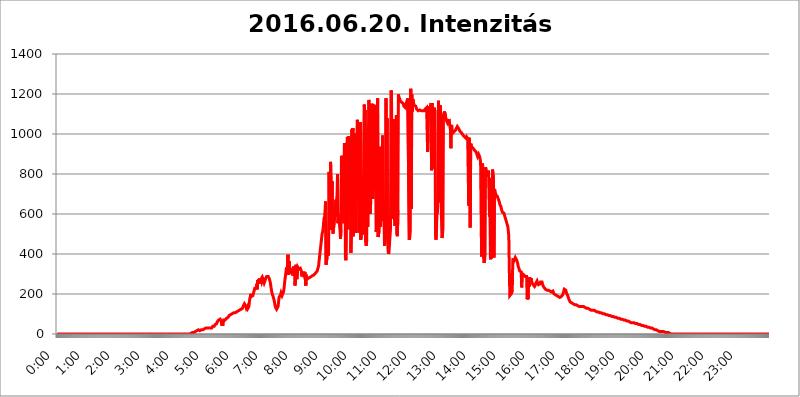
| Category | 2016.06.20. Intenzitás [W/m^2] |
|---|---|
| 0.0 | 0 |
| 0.0006944444444444445 | 0 |
| 0.001388888888888889 | 0 |
| 0.0020833333333333333 | 0 |
| 0.002777777777777778 | 0 |
| 0.003472222222222222 | 0 |
| 0.004166666666666667 | 0 |
| 0.004861111111111111 | 0 |
| 0.005555555555555556 | 0 |
| 0.0062499999999999995 | 0 |
| 0.006944444444444444 | 0 |
| 0.007638888888888889 | 0 |
| 0.008333333333333333 | 0 |
| 0.009027777777777779 | 0 |
| 0.009722222222222222 | 0 |
| 0.010416666666666666 | 0 |
| 0.011111111111111112 | 0 |
| 0.011805555555555555 | 0 |
| 0.012499999999999999 | 0 |
| 0.013194444444444444 | 0 |
| 0.013888888888888888 | 0 |
| 0.014583333333333332 | 0 |
| 0.015277777777777777 | 0 |
| 0.015972222222222224 | 0 |
| 0.016666666666666666 | 0 |
| 0.017361111111111112 | 0 |
| 0.018055555555555557 | 0 |
| 0.01875 | 0 |
| 0.019444444444444445 | 0 |
| 0.02013888888888889 | 0 |
| 0.020833333333333332 | 0 |
| 0.02152777777777778 | 0 |
| 0.022222222222222223 | 0 |
| 0.02291666666666667 | 0 |
| 0.02361111111111111 | 0 |
| 0.024305555555555556 | 0 |
| 0.024999999999999998 | 0 |
| 0.025694444444444447 | 0 |
| 0.02638888888888889 | 0 |
| 0.027083333333333334 | 0 |
| 0.027777777777777776 | 0 |
| 0.02847222222222222 | 0 |
| 0.029166666666666664 | 0 |
| 0.029861111111111113 | 0 |
| 0.030555555555555555 | 0 |
| 0.03125 | 0 |
| 0.03194444444444445 | 0 |
| 0.03263888888888889 | 0 |
| 0.03333333333333333 | 0 |
| 0.034027777777777775 | 0 |
| 0.034722222222222224 | 0 |
| 0.035416666666666666 | 0 |
| 0.036111111111111115 | 0 |
| 0.03680555555555556 | 0 |
| 0.0375 | 0 |
| 0.03819444444444444 | 0 |
| 0.03888888888888889 | 0 |
| 0.03958333333333333 | 0 |
| 0.04027777777777778 | 0 |
| 0.04097222222222222 | 0 |
| 0.041666666666666664 | 0 |
| 0.042361111111111106 | 0 |
| 0.04305555555555556 | 0 |
| 0.043750000000000004 | 0 |
| 0.044444444444444446 | 0 |
| 0.04513888888888889 | 0 |
| 0.04583333333333334 | 0 |
| 0.04652777777777778 | 0 |
| 0.04722222222222222 | 0 |
| 0.04791666666666666 | 0 |
| 0.04861111111111111 | 0 |
| 0.049305555555555554 | 0 |
| 0.049999999999999996 | 0 |
| 0.05069444444444445 | 0 |
| 0.051388888888888894 | 0 |
| 0.052083333333333336 | 0 |
| 0.05277777777777778 | 0 |
| 0.05347222222222222 | 0 |
| 0.05416666666666667 | 0 |
| 0.05486111111111111 | 0 |
| 0.05555555555555555 | 0 |
| 0.05625 | 0 |
| 0.05694444444444444 | 0 |
| 0.057638888888888885 | 0 |
| 0.05833333333333333 | 0 |
| 0.05902777777777778 | 0 |
| 0.059722222222222225 | 0 |
| 0.06041666666666667 | 0 |
| 0.061111111111111116 | 0 |
| 0.06180555555555556 | 0 |
| 0.0625 | 0 |
| 0.06319444444444444 | 0 |
| 0.06388888888888888 | 0 |
| 0.06458333333333334 | 0 |
| 0.06527777777777778 | 0 |
| 0.06597222222222222 | 0 |
| 0.06666666666666667 | 0 |
| 0.06736111111111111 | 0 |
| 0.06805555555555555 | 0 |
| 0.06874999999999999 | 0 |
| 0.06944444444444443 | 0 |
| 0.07013888888888889 | 0 |
| 0.07083333333333333 | 0 |
| 0.07152777777777779 | 0 |
| 0.07222222222222223 | 0 |
| 0.07291666666666667 | 0 |
| 0.07361111111111111 | 0 |
| 0.07430555555555556 | 0 |
| 0.075 | 0 |
| 0.07569444444444444 | 0 |
| 0.0763888888888889 | 0 |
| 0.07708333333333334 | 0 |
| 0.07777777777777778 | 0 |
| 0.07847222222222222 | 0 |
| 0.07916666666666666 | 0 |
| 0.0798611111111111 | 0 |
| 0.08055555555555556 | 0 |
| 0.08125 | 0 |
| 0.08194444444444444 | 0 |
| 0.08263888888888889 | 0 |
| 0.08333333333333333 | 0 |
| 0.08402777777777777 | 0 |
| 0.08472222222222221 | 0 |
| 0.08541666666666665 | 0 |
| 0.08611111111111112 | 0 |
| 0.08680555555555557 | 0 |
| 0.08750000000000001 | 0 |
| 0.08819444444444445 | 0 |
| 0.08888888888888889 | 0 |
| 0.08958333333333333 | 0 |
| 0.09027777777777778 | 0 |
| 0.09097222222222222 | 0 |
| 0.09166666666666667 | 0 |
| 0.09236111111111112 | 0 |
| 0.09305555555555556 | 0 |
| 0.09375 | 0 |
| 0.09444444444444444 | 0 |
| 0.09513888888888888 | 0 |
| 0.09583333333333333 | 0 |
| 0.09652777777777777 | 0 |
| 0.09722222222222222 | 0 |
| 0.09791666666666667 | 0 |
| 0.09861111111111111 | 0 |
| 0.09930555555555555 | 0 |
| 0.09999999999999999 | 0 |
| 0.10069444444444443 | 0 |
| 0.1013888888888889 | 0 |
| 0.10208333333333335 | 0 |
| 0.10277777777777779 | 0 |
| 0.10347222222222223 | 0 |
| 0.10416666666666667 | 0 |
| 0.10486111111111111 | 0 |
| 0.10555555555555556 | 0 |
| 0.10625 | 0 |
| 0.10694444444444444 | 0 |
| 0.1076388888888889 | 0 |
| 0.10833333333333334 | 0 |
| 0.10902777777777778 | 0 |
| 0.10972222222222222 | 0 |
| 0.1111111111111111 | 0 |
| 0.11180555555555556 | 0 |
| 0.11180555555555556 | 0 |
| 0.1125 | 0 |
| 0.11319444444444444 | 0 |
| 0.11388888888888889 | 0 |
| 0.11458333333333333 | 0 |
| 0.11527777777777777 | 0 |
| 0.11597222222222221 | 0 |
| 0.11666666666666665 | 0 |
| 0.1173611111111111 | 0 |
| 0.11805555555555557 | 0 |
| 0.11944444444444445 | 0 |
| 0.12013888888888889 | 0 |
| 0.12083333333333333 | 0 |
| 0.12152777777777778 | 0 |
| 0.12222222222222223 | 0 |
| 0.12291666666666667 | 0 |
| 0.12291666666666667 | 0 |
| 0.12361111111111112 | 0 |
| 0.12430555555555556 | 0 |
| 0.125 | 0 |
| 0.12569444444444444 | 0 |
| 0.12638888888888888 | 0 |
| 0.12708333333333333 | 0 |
| 0.16875 | 0 |
| 0.12847222222222224 | 0 |
| 0.12916666666666668 | 0 |
| 0.12986111111111112 | 0 |
| 0.13055555555555556 | 0 |
| 0.13125 | 0 |
| 0.13194444444444445 | 0 |
| 0.1326388888888889 | 0 |
| 0.13333333333333333 | 0 |
| 0.13402777777777777 | 0 |
| 0.13402777777777777 | 0 |
| 0.13472222222222222 | 0 |
| 0.13541666666666666 | 0 |
| 0.1361111111111111 | 0 |
| 0.13749999999999998 | 0 |
| 0.13819444444444443 | 0 |
| 0.1388888888888889 | 0 |
| 0.13958333333333334 | 0 |
| 0.14027777777777778 | 0 |
| 0.14097222222222222 | 0 |
| 0.14166666666666666 | 0 |
| 0.1423611111111111 | 0 |
| 0.14305555555555557 | 0 |
| 0.14375000000000002 | 0 |
| 0.14444444444444446 | 0 |
| 0.1451388888888889 | 0 |
| 0.1451388888888889 | 0 |
| 0.14652777777777778 | 0 |
| 0.14722222222222223 | 0 |
| 0.14791666666666667 | 0 |
| 0.1486111111111111 | 0 |
| 0.14930555555555555 | 0 |
| 0.15 | 0 |
| 0.15069444444444444 | 0 |
| 0.15138888888888888 | 0 |
| 0.15208333333333332 | 0 |
| 0.15277777777777776 | 0 |
| 0.15347222222222223 | 0 |
| 0.15416666666666667 | 0 |
| 0.15486111111111112 | 0 |
| 0.15555555555555556 | 0 |
| 0.15625 | 0 |
| 0.15694444444444444 | 0 |
| 0.15763888888888888 | 0 |
| 0.15833333333333333 | 0 |
| 0.15902777777777777 | 0 |
| 0.15972222222222224 | 0 |
| 0.16041666666666668 | 0 |
| 0.16111111111111112 | 0 |
| 0.16180555555555556 | 0 |
| 0.1625 | 0 |
| 0.16319444444444445 | 0 |
| 0.1638888888888889 | 0 |
| 0.16458333333333333 | 0 |
| 0.16527777777777777 | 0 |
| 0.16597222222222222 | 0 |
| 0.16666666666666666 | 0 |
| 0.1673611111111111 | 0 |
| 0.16805555555555554 | 0 |
| 0.16874999999999998 | 0 |
| 0.16944444444444443 | 0 |
| 0.17013888888888887 | 0 |
| 0.1708333333333333 | 0 |
| 0.17152777777777775 | 0 |
| 0.17222222222222225 | 0 |
| 0.1729166666666667 | 0 |
| 0.17361111111111113 | 0 |
| 0.17430555555555557 | 0 |
| 0.17500000000000002 | 0 |
| 0.17569444444444446 | 0 |
| 0.1763888888888889 | 0 |
| 0.17708333333333334 | 0 |
| 0.17777777777777778 | 0 |
| 0.17847222222222223 | 0 |
| 0.17916666666666667 | 0 |
| 0.1798611111111111 | 0 |
| 0.18055555555555555 | 0 |
| 0.18125 | 0 |
| 0.18194444444444444 | 0 |
| 0.1826388888888889 | 0 |
| 0.18333333333333335 | 0 |
| 0.1840277777777778 | 0 |
| 0.18472222222222223 | 0 |
| 0.18541666666666667 | 0 |
| 0.18611111111111112 | 0 |
| 0.18680555555555556 | 0 |
| 0.1875 | 3.525 |
| 0.18819444444444444 | 3.525 |
| 0.18888888888888888 | 3.525 |
| 0.18958333333333333 | 7.887 |
| 0.19027777777777777 | 7.887 |
| 0.1909722222222222 | 7.887 |
| 0.19166666666666665 | 7.887 |
| 0.19236111111111112 | 12.257 |
| 0.19305555555555554 | 12.257 |
| 0.19375 | 12.257 |
| 0.19444444444444445 | 12.257 |
| 0.1951388888888889 | 16.636 |
| 0.19583333333333333 | 16.636 |
| 0.19652777777777777 | 16.636 |
| 0.19722222222222222 | 21.024 |
| 0.19791666666666666 | 21.024 |
| 0.1986111111111111 | 16.636 |
| 0.19930555555555554 | 16.636 |
| 0.19999999999999998 | 16.636 |
| 0.20069444444444443 | 16.636 |
| 0.20138888888888887 | 21.024 |
| 0.2020833333333333 | 21.024 |
| 0.2027777777777778 | 21.024 |
| 0.2034722222222222 | 21.024 |
| 0.2041666666666667 | 21.024 |
| 0.20486111111111113 | 21.024 |
| 0.20555555555555557 | 25.419 |
| 0.20625000000000002 | 25.419 |
| 0.20694444444444446 | 25.419 |
| 0.2076388888888889 | 25.419 |
| 0.20833333333333334 | 29.823 |
| 0.20902777777777778 | 29.823 |
| 0.20972222222222223 | 29.823 |
| 0.21041666666666667 | 29.823 |
| 0.2111111111111111 | 29.823 |
| 0.21180555555555555 | 29.823 |
| 0.2125 | 29.823 |
| 0.21319444444444444 | 34.234 |
| 0.2138888888888889 | 29.823 |
| 0.21458333333333335 | 29.823 |
| 0.2152777777777778 | 34.234 |
| 0.21597222222222223 | 29.823 |
| 0.21666666666666667 | 29.823 |
| 0.21736111111111112 | 29.823 |
| 0.21805555555555556 | 38.653 |
| 0.21875 | 34.234 |
| 0.21944444444444444 | 34.234 |
| 0.22013888888888888 | 38.653 |
| 0.22083333333333333 | 38.653 |
| 0.22152777777777777 | 47.511 |
| 0.2222222222222222 | 51.951 |
| 0.22291666666666665 | 43.079 |
| 0.2236111111111111 | 51.951 |
| 0.22430555555555556 | 60.85 |
| 0.225 | 56.398 |
| 0.22569444444444445 | 60.85 |
| 0.2263888888888889 | 69.775 |
| 0.22708333333333333 | 65.31 |
| 0.22777777777777777 | 74.246 |
| 0.22847222222222222 | 74.246 |
| 0.22916666666666666 | 69.775 |
| 0.2298611111111111 | 65.31 |
| 0.23055555555555554 | 47.511 |
| 0.23124999999999998 | 43.079 |
| 0.23194444444444443 | 43.079 |
| 0.23263888888888887 | 47.511 |
| 0.2333333333333333 | 69.775 |
| 0.2340277777777778 | 69.775 |
| 0.2347222222222222 | 69.775 |
| 0.2354166666666667 | 69.775 |
| 0.23611111111111113 | 65.31 |
| 0.23680555555555557 | 69.775 |
| 0.23750000000000002 | 78.722 |
| 0.23819444444444446 | 83.205 |
| 0.2388888888888889 | 83.205 |
| 0.23958333333333334 | 83.205 |
| 0.24027777777777778 | 87.692 |
| 0.24097222222222223 | 92.184 |
| 0.24166666666666667 | 96.682 |
| 0.2423611111111111 | 96.682 |
| 0.24305555555555555 | 96.682 |
| 0.24375 | 101.184 |
| 0.24444444444444446 | 101.184 |
| 0.24513888888888888 | 101.184 |
| 0.24583333333333335 | 101.184 |
| 0.2465277777777778 | 105.69 |
| 0.24722222222222223 | 105.69 |
| 0.24791666666666667 | 105.69 |
| 0.24861111111111112 | 105.69 |
| 0.24930555555555556 | 105.69 |
| 0.25 | 110.201 |
| 0.25069444444444444 | 110.201 |
| 0.2513888888888889 | 110.201 |
| 0.2520833333333333 | 110.201 |
| 0.25277777777777777 | 110.201 |
| 0.2534722222222222 | 114.716 |
| 0.25416666666666665 | 114.716 |
| 0.2548611111111111 | 119.235 |
| 0.2555555555555556 | 119.235 |
| 0.25625000000000003 | 119.235 |
| 0.2569444444444445 | 119.235 |
| 0.2576388888888889 | 123.758 |
| 0.25833333333333336 | 123.758 |
| 0.2590277777777778 | 128.284 |
| 0.25972222222222224 | 128.284 |
| 0.2604166666666667 | 132.814 |
| 0.2611111111111111 | 141.884 |
| 0.26180555555555557 | 146.423 |
| 0.2625 | 150.964 |
| 0.26319444444444445 | 150.964 |
| 0.2638888888888889 | 146.423 |
| 0.26458333333333334 | 137.347 |
| 0.2652777777777778 | 128.284 |
| 0.2659722222222222 | 132.814 |
| 0.26666666666666666 | 137.347 |
| 0.2673611111111111 | 128.284 |
| 0.26805555555555555 | 128.284 |
| 0.26875 | 137.347 |
| 0.26944444444444443 | 160.056 |
| 0.2701388888888889 | 178.264 |
| 0.2708333333333333 | 187.378 |
| 0.27152777777777776 | 201.058 |
| 0.2722222222222222 | 187.378 |
| 0.27291666666666664 | 182.82 |
| 0.2736111111111111 | 182.82 |
| 0.2743055555555555 | 191.937 |
| 0.27499999999999997 | 201.058 |
| 0.27569444444444446 | 210.182 |
| 0.27638888888888885 | 219.309 |
| 0.27708333333333335 | 228.436 |
| 0.2777777777777778 | 228.436 |
| 0.27847222222222223 | 228.436 |
| 0.2791666666666667 | 228.436 |
| 0.2798611111111111 | 251.251 |
| 0.28055555555555556 | 223.873 |
| 0.28125 | 269.49 |
| 0.28194444444444444 | 255.813 |
| 0.2826388888888889 | 274.047 |
| 0.2833333333333333 | 260.373 |
| 0.28402777777777777 | 278.603 |
| 0.2847222222222222 | 251.251 |
| 0.28541666666666665 | 255.813 |
| 0.28611111111111115 | 269.49 |
| 0.28680555555555554 | 260.373 |
| 0.28750000000000003 | 264.932 |
| 0.2881944444444445 | 278.603 |
| 0.2888888888888889 | 278.603 |
| 0.28958333333333336 | 264.932 |
| 0.2902777777777778 | 255.813 |
| 0.29097222222222224 | 260.373 |
| 0.2916666666666667 | 269.49 |
| 0.2923611111111111 | 278.603 |
| 0.29305555555555557 | 283.156 |
| 0.29375 | 287.709 |
| 0.29444444444444445 | 287.709 |
| 0.2951388888888889 | 287.709 |
| 0.29583333333333334 | 287.709 |
| 0.2965277777777778 | 283.156 |
| 0.2972222222222222 | 278.603 |
| 0.29791666666666666 | 274.047 |
| 0.2986111111111111 | 260.373 |
| 0.29930555555555555 | 246.689 |
| 0.3 | 228.436 |
| 0.30069444444444443 | 214.746 |
| 0.3013888888888889 | 201.058 |
| 0.3020833333333333 | 196.497 |
| 0.30277777777777776 | 187.378 |
| 0.3034722222222222 | 178.264 |
| 0.30416666666666664 | 169.156 |
| 0.3048611111111111 | 155.509 |
| 0.3055555555555555 | 141.884 |
| 0.30624999999999997 | 132.814 |
| 0.3069444444444444 | 128.284 |
| 0.3076388888888889 | 123.758 |
| 0.30833333333333335 | 119.235 |
| 0.3090277777777778 | 123.758 |
| 0.30972222222222223 | 137.347 |
| 0.3104166666666667 | 160.056 |
| 0.3111111111111111 | 182.82 |
| 0.31180555555555556 | 187.378 |
| 0.3125 | 187.378 |
| 0.31319444444444444 | 196.497 |
| 0.3138888888888889 | 205.62 |
| 0.3145833333333333 | 205.62 |
| 0.31527777777777777 | 191.937 |
| 0.3159722222222222 | 191.937 |
| 0.31666666666666665 | 196.497 |
| 0.31736111111111115 | 210.182 |
| 0.31805555555555554 | 228.436 |
| 0.31875000000000003 | 251.251 |
| 0.3194444444444445 | 274.047 |
| 0.3201388888888889 | 292.259 |
| 0.32083333333333336 | 296.808 |
| 0.3215277777777778 | 333.113 |
| 0.32222222222222224 | 333.113 |
| 0.3229166666666667 | 319.517 |
| 0.3236111111111111 | 396.164 |
| 0.32430555555555557 | 296.808 |
| 0.325 | 364.728 |
| 0.32569444444444445 | 333.113 |
| 0.3263888888888889 | 319.517 |
| 0.32708333333333334 | 310.44 |
| 0.3277777777777778 | 310.44 |
| 0.3284722222222222 | 314.98 |
| 0.32916666666666666 | 319.517 |
| 0.3298611111111111 | 305.898 |
| 0.33055555555555555 | 292.259 |
| 0.33125 | 337.639 |
| 0.33194444444444443 | 342.162 |
| 0.3326388888888889 | 324.052 |
| 0.3333333333333333 | 242.127 |
| 0.3340277777777778 | 260.373 |
| 0.3347222222222222 | 346.682 |
| 0.3354166666666667 | 287.709 |
| 0.3361111111111111 | 274.047 |
| 0.3368055555555556 | 305.898 |
| 0.33749999999999997 | 333.113 |
| 0.33819444444444446 | 333.113 |
| 0.33888888888888885 | 324.052 |
| 0.33958333333333335 | 324.052 |
| 0.34027777777777773 | 319.517 |
| 0.34097222222222223 | 328.584 |
| 0.3416666666666666 | 324.052 |
| 0.3423611111111111 | 314.98 |
| 0.3430555555555555 | 287.709 |
| 0.34375 | 305.898 |
| 0.3444444444444445 | 310.44 |
| 0.3451388888888889 | 310.44 |
| 0.3458333333333334 | 305.898 |
| 0.34652777777777777 | 283.156 |
| 0.34722222222222227 | 310.44 |
| 0.34791666666666665 | 310.44 |
| 0.34861111111111115 | 242.127 |
| 0.34930555555555554 | 296.808 |
| 0.35000000000000003 | 274.047 |
| 0.3506944444444444 | 274.047 |
| 0.3513888888888889 | 278.603 |
| 0.3520833333333333 | 278.603 |
| 0.3527777777777778 | 278.603 |
| 0.3534722222222222 | 278.603 |
| 0.3541666666666667 | 283.156 |
| 0.3548611111111111 | 283.156 |
| 0.35555555555555557 | 287.709 |
| 0.35625 | 287.709 |
| 0.35694444444444445 | 287.709 |
| 0.3576388888888889 | 287.709 |
| 0.35833333333333334 | 292.259 |
| 0.3590277777777778 | 296.808 |
| 0.3597222222222222 | 296.808 |
| 0.36041666666666666 | 296.808 |
| 0.3611111111111111 | 296.808 |
| 0.36180555555555555 | 301.354 |
| 0.3625 | 305.898 |
| 0.36319444444444443 | 305.898 |
| 0.3638888888888889 | 310.44 |
| 0.3645833333333333 | 314.98 |
| 0.3652777777777778 | 324.052 |
| 0.3659722222222222 | 328.584 |
| 0.3666666666666667 | 342.162 |
| 0.3673611111111111 | 369.23 |
| 0.3680555555555556 | 391.685 |
| 0.36874999999999997 | 414.035 |
| 0.36944444444444446 | 436.27 |
| 0.37013888888888885 | 458.38 |
| 0.37083333333333335 | 480.356 |
| 0.37152777777777773 | 502.192 |
| 0.37222222222222223 | 510.885 |
| 0.3729166666666666 | 528.2 |
| 0.3736111111111111 | 558.261 |
| 0.3743055555555555 | 579.542 |
| 0.375 | 588.009 |
| 0.3756944444444445 | 621.613 |
| 0.3763888888888889 | 663.019 |
| 0.3770833333333334 | 346.682 |
| 0.37777777777777777 | 342.162 |
| 0.37847222222222227 | 387.202 |
| 0.37916666666666665 | 414.035 |
| 0.37986111111111115 | 391.685 |
| 0.38055555555555554 | 409.574 |
| 0.38125000000000003 | 810.641 |
| 0.3819444444444444 | 523.88 |
| 0.3826388888888889 | 541.121 |
| 0.3833333333333333 | 860.676 |
| 0.3840277777777778 | 751.803 |
| 0.3847222222222222 | 519.555 |
| 0.3854166666666667 | 763.674 |
| 0.3861111111111111 | 536.82 |
| 0.38680555555555557 | 502.192 |
| 0.3875 | 506.542 |
| 0.38819444444444445 | 502.192 |
| 0.3888888888888889 | 579.542 |
| 0.38958333333333334 | 642.4 |
| 0.3902777777777778 | 588.009 |
| 0.3909722222222222 | 671.22 |
| 0.39166666666666666 | 596.45 |
| 0.3923611111111111 | 687.544 |
| 0.39305555555555555 | 798.974 |
| 0.39375 | 553.986 |
| 0.39444444444444443 | 579.542 |
| 0.3951388888888889 | 566.793 |
| 0.3958333333333333 | 596.45 |
| 0.3965277777777778 | 523.88 |
| 0.3972222222222222 | 475.972 |
| 0.3979166666666667 | 519.555 |
| 0.3986111111111111 | 891.099 |
| 0.3993055555555556 | 879.719 |
| 0.39999999999999997 | 592.233 |
| 0.40069444444444446 | 751.803 |
| 0.40138888888888885 | 699.717 |
| 0.40208333333333335 | 553.986 |
| 0.40277777777777773 | 955.071 |
| 0.40347222222222223 | 940.082 |
| 0.4041666666666666 | 382.715 |
| 0.4048611111111111 | 369.23 |
| 0.4055555555555555 | 638.256 |
| 0.40625 | 841.526 |
| 0.4069444444444445 | 984.98 |
| 0.4076388888888889 | 523.88 |
| 0.4083333333333334 | 988.714 |
| 0.40902777777777777 | 940.082 |
| 0.40972222222222227 | 981.244 |
| 0.41041666666666665 | 925.06 |
| 0.41111111111111115 | 837.682 |
| 0.41180555555555554 | 405.108 |
| 0.41250000000000003 | 510.885 |
| 0.4131944444444444 | 1022.323 |
| 0.4138888888888889 | 849.199 |
| 0.4145833333333333 | 1029.798 |
| 0.4152777777777778 | 489.108 |
| 0.4159722222222222 | 992.448 |
| 0.4166666666666667 | 1003.65 |
| 0.4173611111111111 | 532.513 |
| 0.41805555555555557 | 739.877 |
| 0.41875 | 506.542 |
| 0.41944444444444445 | 528.2 |
| 0.4201388888888889 | 943.832 |
| 0.42083333333333334 | 1071.027 |
| 0.4215277777777778 | 1048.508 |
| 0.4222222222222222 | 1056.004 |
| 0.42291666666666666 | 1029.798 |
| 0.4236111111111111 | 506.542 |
| 0.42430555555555555 | 928.819 |
| 0.425 | 1059.756 |
| 0.42569444444444443 | 471.582 |
| 0.4263888888888889 | 510.885 |
| 0.4270833333333333 | 515.223 |
| 0.4277777777777778 | 506.542 |
| 0.4284722222222222 | 506.542 |
| 0.4291666666666667 | 532.513 |
| 0.4298611111111111 | 966.295 |
| 0.4305555555555556 | 1147.086 |
| 0.43124999999999997 | 1112.618 |
| 0.43194444444444446 | 1120.238 |
| 0.43263888888888885 | 458.38 |
| 0.43333333333333335 | 440.702 |
| 0.43402777777777773 | 467.187 |
| 0.43472222222222223 | 1029.798 |
| 0.4354166666666666 | 536.82 |
| 0.4361111111111111 | 787.258 |
| 0.4368055555555555 | 1170.358 |
| 0.4375 | 1162.571 |
| 0.4381944444444445 | 1162.571 |
| 0.4388888888888889 | 600.661 |
| 0.4395833333333334 | 658.909 |
| 0.44027777777777777 | 1150.946 |
| 0.44097222222222227 | 743.859 |
| 0.44166666666666665 | 1014.852 |
| 0.44236111111111115 | 675.311 |
| 0.44305555555555554 | 891.099 |
| 0.44375000000000003 | 1143.232 |
| 0.4444444444444444 | 1143.232 |
| 0.4451388888888889 | 1143.232 |
| 0.4458333333333333 | 1139.384 |
| 0.4465277777777778 | 1139.384 |
| 0.4472222222222222 | 510.885 |
| 0.4479166666666667 | 528.2 |
| 0.4486111111111111 | 613.252 |
| 0.44930555555555557 | 1178.177 |
| 0.45 | 484.735 |
| 0.45069444444444445 | 480.356 |
| 0.4513888888888889 | 515.223 |
| 0.45208333333333334 | 575.299 |
| 0.4527777777777778 | 936.33 |
| 0.4534722222222222 | 536.82 |
| 0.45416666666666666 | 872.114 |
| 0.4548611111111111 | 566.793 |
| 0.45555555555555555 | 695.666 |
| 0.45625 | 992.448 |
| 0.45694444444444443 | 634.105 |
| 0.4576388888888889 | 671.22 |
| 0.4583333333333333 | 562.53 |
| 0.4590277777777778 | 440.702 |
| 0.4597222222222222 | 445.129 |
| 0.4604166666666667 | 497.836 |
| 0.4611111111111111 | 1178.177 |
| 0.4618055555555556 | 475.972 |
| 0.46249999999999997 | 1078.555 |
| 0.46319444444444446 | 497.836 |
| 0.46388888888888885 | 422.943 |
| 0.46458333333333335 | 400.638 |
| 0.46527777777777773 | 409.574 |
| 0.46597222222222223 | 449.551 |
| 0.4666666666666666 | 453.968 |
| 0.4673611111111111 | 523.88 |
| 0.4680555555555555 | 1217.812 |
| 0.46875 | 1209.807 |
| 0.4694444444444445 | 1205.82 |
| 0.4701388888888889 | 575.299 |
| 0.4708333333333334 | 798.974 |
| 0.47152777777777777 | 1041.019 |
| 0.47222222222222227 | 1074.789 |
| 0.47291666666666665 | 575.299 |
| 0.47361111111111115 | 541.121 |
| 0.47430555555555554 | 562.53 |
| 0.47500000000000003 | 549.704 |
| 0.4756944444444444 | 1093.653 |
| 0.4763888888888889 | 497.836 |
| 0.4770833333333333 | 489.108 |
| 0.4777777777777778 | 617.436 |
| 0.4784722222222222 | 1197.876 |
| 0.4791666666666667 | 1182.099 |
| 0.4798611111111111 | 1186.03 |
| 0.48055555555555557 | 1174.263 |
| 0.48125 | 1162.571 |
| 0.48194444444444445 | 1162.571 |
| 0.4826388888888889 | 1158.689 |
| 0.48333333333333334 | 1158.689 |
| 0.4840277777777778 | 1162.571 |
| 0.4847222222222222 | 1158.689 |
| 0.48541666666666666 | 1150.946 |
| 0.4861111111111111 | 1139.384 |
| 0.48680555555555555 | 1135.543 |
| 0.4875 | 1135.543 |
| 0.48819444444444443 | 1131.708 |
| 0.4888888888888889 | 1147.086 |
| 0.4895833333333333 | 1154.814 |
| 0.4902777777777778 | 1162.571 |
| 0.4909722222222222 | 1162.571 |
| 0.4916666666666667 | 1178.177 |
| 0.4923611111111111 | 1182.099 |
| 0.4930555555555556 | 1174.263 |
| 0.49374999999999997 | 471.582 |
| 0.49444444444444446 | 484.735 |
| 0.49513888888888885 | 515.223 |
| 0.49583333333333335 | 1225.859 |
| 0.49652777777777773 | 625.784 |
| 0.49722222222222223 | 1197.876 |
| 0.4979166666666666 | 1112.618 |
| 0.4986111111111111 | 1174.263 |
| 0.4993055555555555 | 1162.571 |
| 0.5 | 1150.946 |
| 0.5006944444444444 | 1143.232 |
| 0.5013888888888889 | 1139.384 |
| 0.5020833333333333 | 1139.384 |
| 0.5027777777777778 | 1139.384 |
| 0.5034722222222222 | 1131.708 |
| 0.5041666666666667 | 1124.056 |
| 0.5048611111111111 | 1127.879 |
| 0.5055555555555555 | 1120.238 |
| 0.50625 | 1116.426 |
| 0.5069444444444444 | 1116.426 |
| 0.5076388888888889 | 1116.426 |
| 0.5083333333333333 | 1120.238 |
| 0.5090277777777777 | 1116.426 |
| 0.5097222222222222 | 1116.426 |
| 0.5104166666666666 | 1116.426 |
| 0.5111111111111112 | 1116.426 |
| 0.5118055555555555 | 1116.426 |
| 0.5125000000000001 | 1116.426 |
| 0.5131944444444444 | 1116.426 |
| 0.513888888888889 | 1116.426 |
| 0.5145833333333333 | 1116.426 |
| 0.5152777777777778 | 1120.238 |
| 0.5159722222222222 | 1124.056 |
| 0.5166666666666667 | 1124.056 |
| 0.517361111111111 | 1127.879 |
| 0.5180555555555556 | 1131.708 |
| 0.5187499999999999 | 1135.543 |
| 0.5194444444444445 | 909.996 |
| 0.5201388888888888 | 996.182 |
| 0.5208333333333334 | 1139.384 |
| 0.5215277777777778 | 1112.618 |
| 0.5222222222222223 | 1116.426 |
| 0.5229166666666667 | 1127.879 |
| 0.5236111111111111 | 1139.384 |
| 0.5243055555555556 | 1154.814 |
| 0.525 | 818.392 |
| 0.5256944444444445 | 1154.814 |
| 0.5263888888888889 | 1007.383 |
| 0.5270833333333333 | 826.123 |
| 0.5277777777777778 | 1089.873 |
| 0.5284722222222222 | 1131.708 |
| 0.5291666666666667 | 1131.708 |
| 0.5298611111111111 | 1112.618 |
| 0.5305555555555556 | 493.475 |
| 0.53125 | 471.582 |
| 0.5319444444444444 | 532.513 |
| 0.5326388888888889 | 600.661 |
| 0.5333333333333333 | 609.062 |
| 0.5340277777777778 | 671.22 |
| 0.5347222222222222 | 1166.46 |
| 0.5354166666666667 | 1170.358 |
| 0.5361111111111111 | 658.909 |
| 0.5368055555555555 | 1143.232 |
| 0.5375 | 1131.708 |
| 0.5381944444444444 | 864.493 |
| 0.5388888888888889 | 583.779 |
| 0.5395833333333333 | 480.356 |
| 0.5402777777777777 | 493.475 |
| 0.5409722222222222 | 528.2 |
| 0.5416666666666666 | 1101.226 |
| 0.5423611111111112 | 1093.653 |
| 0.5430555555555555 | 1112.618 |
| 0.5437500000000001 | 1108.816 |
| 0.5444444444444444 | 1093.653 |
| 0.545138888888889 | 1074.789 |
| 0.5458333333333333 | 1067.267 |
| 0.5465277777777778 | 1067.267 |
| 0.5472222222222222 | 1056.004 |
| 0.5479166666666667 | 1059.756 |
| 0.548611111111111 | 1067.267 |
| 0.5493055555555556 | 1074.789 |
| 0.5499999999999999 | 1078.555 |
| 0.5506944444444445 | 1041.019 |
| 0.5513888888888888 | 1022.323 |
| 0.5520833333333334 | 928.819 |
| 0.5527777777777778 | 1044.762 |
| 0.5534722222222223 | 1037.277 |
| 0.5541666666666667 | 1007.383 |
| 0.5548611111111111 | 1018.587 |
| 0.5555555555555556 | 1007.383 |
| 0.55625 | 1011.118 |
| 0.5569444444444445 | 1011.118 |
| 0.5576388888888889 | 1014.852 |
| 0.5583333333333333 | 1011.118 |
| 0.5590277777777778 | 1022.323 |
| 0.5597222222222222 | 1026.06 |
| 0.5604166666666667 | 1026.06 |
| 0.5611111111111111 | 1037.277 |
| 0.5618055555555556 | 1041.019 |
| 0.5625 | 1037.277 |
| 0.5631944444444444 | 1026.06 |
| 0.5638888888888889 | 1022.323 |
| 0.5645833333333333 | 1014.852 |
| 0.5652777777777778 | 1014.852 |
| 0.5659722222222222 | 1011.118 |
| 0.5666666666666667 | 1007.383 |
| 0.5673611111111111 | 1007.383 |
| 0.5680555555555555 | 999.916 |
| 0.56875 | 999.916 |
| 0.5694444444444444 | 992.448 |
| 0.5701388888888889 | 988.714 |
| 0.5708333333333333 | 992.448 |
| 0.5715277777777777 | 984.98 |
| 0.5722222222222222 | 981.244 |
| 0.5729166666666666 | 981.244 |
| 0.5736111111111112 | 977.508 |
| 0.5743055555555555 | 984.98 |
| 0.5750000000000001 | 984.98 |
| 0.5756944444444444 | 977.508 |
| 0.576388888888889 | 981.244 |
| 0.5770833333333333 | 642.4 |
| 0.5777777777777778 | 981.244 |
| 0.5784722222222222 | 795.074 |
| 0.5791666666666667 | 532.513 |
| 0.579861111111111 | 951.327 |
| 0.5805555555555556 | 943.832 |
| 0.5812499999999999 | 940.082 |
| 0.5819444444444445 | 932.576 |
| 0.5826388888888888 | 932.576 |
| 0.5833333333333334 | 932.576 |
| 0.5840277777777778 | 925.06 |
| 0.5847222222222223 | 921.298 |
| 0.5854166666666667 | 917.534 |
| 0.5861111111111111 | 917.534 |
| 0.5868055555555556 | 917.534 |
| 0.5875 | 909.996 |
| 0.5881944444444445 | 902.447 |
| 0.5888888888888889 | 894.885 |
| 0.5895833333333333 | 887.309 |
| 0.5902777777777778 | 891.099 |
| 0.5909722222222222 | 898.668 |
| 0.5916666666666667 | 894.885 |
| 0.5923611111111111 | 887.309 |
| 0.5930555555555556 | 875.918 |
| 0.59375 | 860.676 |
| 0.5944444444444444 | 860.676 |
| 0.5951388888888889 | 387.202 |
| 0.5958333333333333 | 763.674 |
| 0.5965277777777778 | 853.029 |
| 0.5972222222222222 | 853.029 |
| 0.5979166666666667 | 382.715 |
| 0.5986111111111111 | 355.712 |
| 0.5993055555555555 | 369.23 |
| 0.6 | 396.164 |
| 0.6006944444444444 | 833.834 |
| 0.6013888888888889 | 822.26 |
| 0.6020833333333333 | 818.392 |
| 0.6027777777777777 | 810.641 |
| 0.6034722222222222 | 810.641 |
| 0.6041666666666666 | 806.757 |
| 0.6048611111111112 | 810.641 |
| 0.6055555555555555 | 814.519 |
| 0.6062500000000001 | 588.009 |
| 0.6069444444444444 | 779.42 |
| 0.607638888888889 | 373.729 |
| 0.6083333333333333 | 440.702 |
| 0.6090277777777778 | 378.224 |
| 0.6097222222222222 | 414.035 |
| 0.6104166666666667 | 822.26 |
| 0.611111111111111 | 806.757 |
| 0.6118055555555556 | 791.169 |
| 0.6124999999999999 | 382.715 |
| 0.6131944444444445 | 723.889 |
| 0.6138888888888888 | 715.858 |
| 0.6145833333333334 | 703.762 |
| 0.6152777777777778 | 695.666 |
| 0.6159722222222223 | 691.608 |
| 0.6166666666666667 | 691.608 |
| 0.6173611111111111 | 687.544 |
| 0.6180555555555556 | 679.395 |
| 0.61875 | 675.311 |
| 0.6194444444444445 | 667.123 |
| 0.6201388888888889 | 658.909 |
| 0.6208333333333333 | 646.537 |
| 0.6215277777777778 | 646.537 |
| 0.6222222222222222 | 638.256 |
| 0.6229166666666667 | 625.784 |
| 0.6236111111111111 | 621.613 |
| 0.6243055555555556 | 609.062 |
| 0.625 | 609.062 |
| 0.6256944444444444 | 609.062 |
| 0.6263888888888889 | 604.864 |
| 0.6270833333333333 | 609.062 |
| 0.6277777777777778 | 600.661 |
| 0.6284722222222222 | 579.542 |
| 0.6291666666666667 | 571.049 |
| 0.6298611111111111 | 566.793 |
| 0.6305555555555555 | 553.986 |
| 0.63125 | 545.416 |
| 0.6319444444444444 | 536.82 |
| 0.6326388888888889 | 515.223 |
| 0.6333333333333333 | 489.108 |
| 0.6340277777777777 | 324.052 |
| 0.6347222222222222 | 191.937 |
| 0.6354166666666666 | 187.378 |
| 0.6361111111111112 | 196.497 |
| 0.6368055555555555 | 201.058 |
| 0.6375000000000001 | 205.62 |
| 0.6381944444444444 | 214.746 |
| 0.638888888888889 | 369.23 |
| 0.6395833333333333 | 378.224 |
| 0.6402777777777778 | 364.728 |
| 0.6409722222222222 | 364.728 |
| 0.6416666666666667 | 369.23 |
| 0.642361111111111 | 382.715 |
| 0.6430555555555556 | 382.715 |
| 0.6437499999999999 | 378.224 |
| 0.6444444444444445 | 369.23 |
| 0.6451388888888888 | 364.728 |
| 0.6458333333333334 | 351.198 |
| 0.6465277777777778 | 337.639 |
| 0.6472222222222223 | 333.113 |
| 0.6479166666666667 | 324.052 |
| 0.6486111111111111 | 314.98 |
| 0.6493055555555556 | 310.44 |
| 0.65 | 310.44 |
| 0.6506944444444445 | 310.44 |
| 0.6513888888888889 | 233 |
| 0.6520833333333333 | 301.354 |
| 0.6527777777777778 | 301.354 |
| 0.6534722222222222 | 296.808 |
| 0.6541666666666667 | 296.808 |
| 0.6548611111111111 | 296.808 |
| 0.6555555555555556 | 292.259 |
| 0.65625 | 287.709 |
| 0.6569444444444444 | 287.709 |
| 0.6576388888888889 | 292.259 |
| 0.6583333333333333 | 287.709 |
| 0.6590277777777778 | 173.709 |
| 0.6597222222222222 | 182.82 |
| 0.6604166666666667 | 173.709 |
| 0.6611111111111111 | 278.603 |
| 0.6618055555555555 | 237.564 |
| 0.6625 | 283.156 |
| 0.6631944444444444 | 287.709 |
| 0.6638888888888889 | 269.49 |
| 0.6645833333333333 | 278.603 |
| 0.6652777777777777 | 264.932 |
| 0.6659722222222222 | 255.813 |
| 0.6666666666666666 | 251.251 |
| 0.6673611111111111 | 246.689 |
| 0.6680555555555556 | 242.127 |
| 0.6687500000000001 | 242.127 |
| 0.6694444444444444 | 237.564 |
| 0.6701388888888888 | 242.127 |
| 0.6708333333333334 | 246.689 |
| 0.6715277777777778 | 255.813 |
| 0.6722222222222222 | 260.373 |
| 0.6729166666666666 | 264.932 |
| 0.6736111111111112 | 255.813 |
| 0.6743055555555556 | 251.251 |
| 0.6749999999999999 | 246.689 |
| 0.6756944444444444 | 246.689 |
| 0.6763888888888889 | 246.689 |
| 0.6770833333333334 | 251.251 |
| 0.6777777777777777 | 260.373 |
| 0.6784722222222223 | 264.932 |
| 0.6791666666666667 | 264.932 |
| 0.6798611111111111 | 260.373 |
| 0.6805555555555555 | 251.251 |
| 0.68125 | 242.127 |
| 0.6819444444444445 | 237.564 |
| 0.6826388888888889 | 233 |
| 0.6833333333333332 | 228.436 |
| 0.6840277777777778 | 228.436 |
| 0.6847222222222222 | 223.873 |
| 0.6854166666666667 | 223.873 |
| 0.686111111111111 | 223.873 |
| 0.6868055555555556 | 219.309 |
| 0.6875 | 223.873 |
| 0.6881944444444444 | 219.309 |
| 0.688888888888889 | 219.309 |
| 0.6895833333333333 | 219.309 |
| 0.6902777777777778 | 219.309 |
| 0.6909722222222222 | 214.746 |
| 0.6916666666666668 | 210.182 |
| 0.6923611111111111 | 210.182 |
| 0.6930555555555555 | 210.182 |
| 0.69375 | 210.182 |
| 0.6944444444444445 | 214.746 |
| 0.6951388888888889 | 214.746 |
| 0.6958333333333333 | 210.182 |
| 0.6965277777777777 | 201.058 |
| 0.6972222222222223 | 196.497 |
| 0.6979166666666666 | 196.497 |
| 0.6986111111111111 | 196.497 |
| 0.6993055555555556 | 201.058 |
| 0.7000000000000001 | 196.497 |
| 0.7006944444444444 | 191.937 |
| 0.7013888888888888 | 191.937 |
| 0.7020833333333334 | 187.378 |
| 0.7027777777777778 | 187.378 |
| 0.7034722222222222 | 182.82 |
| 0.7041666666666666 | 182.82 |
| 0.7048611111111112 | 182.82 |
| 0.7055555555555556 | 182.82 |
| 0.7062499999999999 | 182.82 |
| 0.7069444444444444 | 187.378 |
| 0.7076388888888889 | 191.937 |
| 0.7083333333333334 | 191.937 |
| 0.7090277777777777 | 196.497 |
| 0.7097222222222223 | 205.62 |
| 0.7104166666666667 | 214.746 |
| 0.7111111111111111 | 223.873 |
| 0.7118055555555555 | 223.873 |
| 0.7125 | 223.873 |
| 0.7131944444444445 | 219.309 |
| 0.7138888888888889 | 210.182 |
| 0.7145833333333332 | 201.058 |
| 0.7152777777777778 | 196.497 |
| 0.7159722222222222 | 191.937 |
| 0.7166666666666667 | 182.82 |
| 0.717361111111111 | 178.264 |
| 0.7180555555555556 | 169.156 |
| 0.71875 | 164.605 |
| 0.7194444444444444 | 160.056 |
| 0.720138888888889 | 160.056 |
| 0.7208333333333333 | 155.509 |
| 0.7215277777777778 | 155.509 |
| 0.7222222222222222 | 150.964 |
| 0.7229166666666668 | 150.964 |
| 0.7236111111111111 | 150.964 |
| 0.7243055555555555 | 150.964 |
| 0.725 | 150.964 |
| 0.7256944444444445 | 146.423 |
| 0.7263888888888889 | 146.423 |
| 0.7270833333333333 | 146.423 |
| 0.7277777777777777 | 146.423 |
| 0.7284722222222223 | 146.423 |
| 0.7291666666666666 | 141.884 |
| 0.7298611111111111 | 141.884 |
| 0.7305555555555556 | 137.347 |
| 0.7312500000000001 | 137.347 |
| 0.7319444444444444 | 137.347 |
| 0.7326388888888888 | 137.347 |
| 0.7333333333333334 | 137.347 |
| 0.7340277777777778 | 137.347 |
| 0.7347222222222222 | 137.347 |
| 0.7354166666666666 | 137.347 |
| 0.7361111111111112 | 137.347 |
| 0.7368055555555556 | 137.347 |
| 0.7374999999999999 | 132.814 |
| 0.7381944444444444 | 137.347 |
| 0.7388888888888889 | 132.814 |
| 0.7395833333333334 | 132.814 |
| 0.7402777777777777 | 132.814 |
| 0.7409722222222223 | 132.814 |
| 0.7416666666666667 | 128.284 |
| 0.7423611111111111 | 128.284 |
| 0.7430555555555555 | 128.284 |
| 0.74375 | 128.284 |
| 0.7444444444444445 | 128.284 |
| 0.7451388888888889 | 128.284 |
| 0.7458333333333332 | 123.758 |
| 0.7465277777777778 | 123.758 |
| 0.7472222222222222 | 123.758 |
| 0.7479166666666667 | 123.758 |
| 0.748611111111111 | 119.235 |
| 0.7493055555555556 | 119.235 |
| 0.75 | 119.235 |
| 0.7506944444444444 | 119.235 |
| 0.751388888888889 | 119.235 |
| 0.7520833333333333 | 119.235 |
| 0.7527777777777778 | 119.235 |
| 0.7534722222222222 | 114.716 |
| 0.7541666666666668 | 114.716 |
| 0.7548611111111111 | 114.716 |
| 0.7555555555555555 | 114.716 |
| 0.75625 | 110.201 |
| 0.7569444444444445 | 110.201 |
| 0.7576388888888889 | 110.201 |
| 0.7583333333333333 | 110.201 |
| 0.7590277777777777 | 110.201 |
| 0.7597222222222223 | 110.201 |
| 0.7604166666666666 | 105.69 |
| 0.7611111111111111 | 105.69 |
| 0.7618055555555556 | 105.69 |
| 0.7625000000000001 | 105.69 |
| 0.7631944444444444 | 105.69 |
| 0.7638888888888888 | 101.184 |
| 0.7645833333333334 | 101.184 |
| 0.7652777777777778 | 101.184 |
| 0.7659722222222222 | 101.184 |
| 0.7666666666666666 | 101.184 |
| 0.7673611111111112 | 101.184 |
| 0.7680555555555556 | 101.184 |
| 0.7687499999999999 | 96.682 |
| 0.7694444444444444 | 96.682 |
| 0.7701388888888889 | 96.682 |
| 0.7708333333333334 | 96.682 |
| 0.7715277777777777 | 96.682 |
| 0.7722222222222223 | 96.682 |
| 0.7729166666666667 | 92.184 |
| 0.7736111111111111 | 92.184 |
| 0.7743055555555555 | 92.184 |
| 0.775 | 92.184 |
| 0.7756944444444445 | 92.184 |
| 0.7763888888888889 | 92.184 |
| 0.7770833333333332 | 92.184 |
| 0.7777777777777778 | 87.692 |
| 0.7784722222222222 | 87.692 |
| 0.7791666666666667 | 87.692 |
| 0.779861111111111 | 87.692 |
| 0.7805555555555556 | 87.692 |
| 0.78125 | 83.205 |
| 0.7819444444444444 | 83.205 |
| 0.782638888888889 | 83.205 |
| 0.7833333333333333 | 83.205 |
| 0.7840277777777778 | 83.205 |
| 0.7847222222222222 | 83.205 |
| 0.7854166666666668 | 83.205 |
| 0.7861111111111111 | 78.722 |
| 0.7868055555555555 | 78.722 |
| 0.7875 | 78.722 |
| 0.7881944444444445 | 78.722 |
| 0.7888888888888889 | 78.722 |
| 0.7895833333333333 | 74.246 |
| 0.7902777777777777 | 74.246 |
| 0.7909722222222223 | 74.246 |
| 0.7916666666666666 | 74.246 |
| 0.7923611111111111 | 74.246 |
| 0.7930555555555556 | 74.246 |
| 0.7937500000000001 | 69.775 |
| 0.7944444444444444 | 69.775 |
| 0.7951388888888888 | 69.775 |
| 0.7958333333333334 | 69.775 |
| 0.7965277777777778 | 69.775 |
| 0.7972222222222222 | 65.31 |
| 0.7979166666666666 | 65.31 |
| 0.7986111111111112 | 65.31 |
| 0.7993055555555556 | 65.31 |
| 0.7999999999999999 | 65.31 |
| 0.8006944444444444 | 65.31 |
| 0.8013888888888889 | 60.85 |
| 0.8020833333333334 | 60.85 |
| 0.8027777777777777 | 60.85 |
| 0.8034722222222223 | 60.85 |
| 0.8041666666666667 | 60.85 |
| 0.8048611111111111 | 56.398 |
| 0.8055555555555555 | 56.398 |
| 0.80625 | 56.398 |
| 0.8069444444444445 | 56.398 |
| 0.8076388888888889 | 56.398 |
| 0.8083333333333332 | 56.398 |
| 0.8090277777777778 | 56.398 |
| 0.8097222222222222 | 56.398 |
| 0.8104166666666667 | 56.398 |
| 0.811111111111111 | 51.951 |
| 0.8118055555555556 | 51.951 |
| 0.8125 | 51.951 |
| 0.8131944444444444 | 51.951 |
| 0.813888888888889 | 51.951 |
| 0.8145833333333333 | 47.511 |
| 0.8152777777777778 | 47.511 |
| 0.8159722222222222 | 47.511 |
| 0.8166666666666668 | 47.511 |
| 0.8173611111111111 | 47.511 |
| 0.8180555555555555 | 47.511 |
| 0.81875 | 43.079 |
| 0.8194444444444445 | 43.079 |
| 0.8201388888888889 | 43.079 |
| 0.8208333333333333 | 43.079 |
| 0.8215277777777777 | 43.079 |
| 0.8222222222222223 | 43.079 |
| 0.8229166666666666 | 38.653 |
| 0.8236111111111111 | 38.653 |
| 0.8243055555555556 | 38.653 |
| 0.8250000000000001 | 38.653 |
| 0.8256944444444444 | 38.653 |
| 0.8263888888888888 | 38.653 |
| 0.8270833333333334 | 38.653 |
| 0.8277777777777778 | 34.234 |
| 0.8284722222222222 | 34.234 |
| 0.8291666666666666 | 34.234 |
| 0.8298611111111112 | 34.234 |
| 0.8305555555555556 | 29.823 |
| 0.8312499999999999 | 29.823 |
| 0.8319444444444444 | 29.823 |
| 0.8326388888888889 | 29.823 |
| 0.8333333333333334 | 29.823 |
| 0.8340277777777777 | 29.823 |
| 0.8347222222222223 | 29.823 |
| 0.8354166666666667 | 25.419 |
| 0.8361111111111111 | 25.419 |
| 0.8368055555555555 | 25.419 |
| 0.8375 | 21.024 |
| 0.8381944444444445 | 21.024 |
| 0.8388888888888889 | 21.024 |
| 0.8395833333333332 | 21.024 |
| 0.8402777777777778 | 21.024 |
| 0.8409722222222222 | 16.636 |
| 0.8416666666666667 | 16.636 |
| 0.842361111111111 | 16.636 |
| 0.8430555555555556 | 16.636 |
| 0.84375 | 16.636 |
| 0.8444444444444444 | 12.257 |
| 0.845138888888889 | 12.257 |
| 0.8458333333333333 | 12.257 |
| 0.8465277777777778 | 12.257 |
| 0.8472222222222222 | 12.257 |
| 0.8479166666666668 | 12.257 |
| 0.8486111111111111 | 12.257 |
| 0.8493055555555555 | 7.887 |
| 0.85 | 7.887 |
| 0.8506944444444445 | 12.257 |
| 0.8513888888888889 | 7.887 |
| 0.8520833333333333 | 7.887 |
| 0.8527777777777777 | 7.887 |
| 0.8534722222222223 | 7.887 |
| 0.8541666666666666 | 7.887 |
| 0.8548611111111111 | 7.887 |
| 0.8555555555555556 | 7.887 |
| 0.8562500000000001 | 7.887 |
| 0.8569444444444444 | 7.887 |
| 0.8576388888888888 | 3.525 |
| 0.8583333333333334 | 3.525 |
| 0.8590277777777778 | 3.525 |
| 0.8597222222222222 | 3.525 |
| 0.8604166666666666 | 3.525 |
| 0.8611111111111112 | 0 |
| 0.8618055555555556 | 0 |
| 0.8624999999999999 | 0 |
| 0.8631944444444444 | 0 |
| 0.8638888888888889 | 0 |
| 0.8645833333333334 | 0 |
| 0.8652777777777777 | 0 |
| 0.8659722222222223 | 0 |
| 0.8666666666666667 | 0 |
| 0.8673611111111111 | 0 |
| 0.8680555555555555 | 0 |
| 0.86875 | 0 |
| 0.8694444444444445 | 0 |
| 0.8701388888888889 | 0 |
| 0.8708333333333332 | 0 |
| 0.8715277777777778 | 0 |
| 0.8722222222222222 | 0 |
| 0.8729166666666667 | 0 |
| 0.873611111111111 | 0 |
| 0.8743055555555556 | 0 |
| 0.875 | 0 |
| 0.8756944444444444 | 0 |
| 0.876388888888889 | 0 |
| 0.8770833333333333 | 0 |
| 0.8777777777777778 | 0 |
| 0.8784722222222222 | 0 |
| 0.8791666666666668 | 0 |
| 0.8798611111111111 | 0 |
| 0.8805555555555555 | 0 |
| 0.88125 | 0 |
| 0.8819444444444445 | 0 |
| 0.8826388888888889 | 0 |
| 0.8833333333333333 | 0 |
| 0.8840277777777777 | 0 |
| 0.8847222222222223 | 0 |
| 0.8854166666666666 | 0 |
| 0.8861111111111111 | 0 |
| 0.8868055555555556 | 0 |
| 0.8875000000000001 | 0 |
| 0.8881944444444444 | 0 |
| 0.8888888888888888 | 0 |
| 0.8895833333333334 | 0 |
| 0.8902777777777778 | 0 |
| 0.8909722222222222 | 0 |
| 0.8916666666666666 | 0 |
| 0.8923611111111112 | 0 |
| 0.8930555555555556 | 0 |
| 0.8937499999999999 | 0 |
| 0.8944444444444444 | 0 |
| 0.8951388888888889 | 0 |
| 0.8958333333333334 | 0 |
| 0.8965277777777777 | 0 |
| 0.8972222222222223 | 0 |
| 0.8979166666666667 | 0 |
| 0.8986111111111111 | 0 |
| 0.8993055555555555 | 0 |
| 0.9 | 0 |
| 0.9006944444444445 | 0 |
| 0.9013888888888889 | 0 |
| 0.9020833333333332 | 0 |
| 0.9027777777777778 | 0 |
| 0.9034722222222222 | 0 |
| 0.9041666666666667 | 0 |
| 0.904861111111111 | 0 |
| 0.9055555555555556 | 0 |
| 0.90625 | 0 |
| 0.9069444444444444 | 0 |
| 0.907638888888889 | 0 |
| 0.9083333333333333 | 0 |
| 0.9090277777777778 | 0 |
| 0.9097222222222222 | 0 |
| 0.9104166666666668 | 0 |
| 0.9111111111111111 | 0 |
| 0.9118055555555555 | 0 |
| 0.9125 | 0 |
| 0.9131944444444445 | 0 |
| 0.9138888888888889 | 0 |
| 0.9145833333333333 | 0 |
| 0.9152777777777777 | 0 |
| 0.9159722222222223 | 0 |
| 0.9166666666666666 | 0 |
| 0.9173611111111111 | 0 |
| 0.9180555555555556 | 0 |
| 0.9187500000000001 | 0 |
| 0.9194444444444444 | 0 |
| 0.9201388888888888 | 0 |
| 0.9208333333333334 | 0 |
| 0.9215277777777778 | 0 |
| 0.9222222222222222 | 0 |
| 0.9229166666666666 | 0 |
| 0.9236111111111112 | 0 |
| 0.9243055555555556 | 0 |
| 0.9249999999999999 | 0 |
| 0.9256944444444444 | 0 |
| 0.9263888888888889 | 0 |
| 0.9270833333333334 | 0 |
| 0.9277777777777777 | 0 |
| 0.9284722222222223 | 0 |
| 0.9291666666666667 | 0 |
| 0.9298611111111111 | 0 |
| 0.9305555555555555 | 0 |
| 0.93125 | 0 |
| 0.9319444444444445 | 0 |
| 0.9326388888888889 | 0 |
| 0.9333333333333332 | 0 |
| 0.9340277777777778 | 0 |
| 0.9347222222222222 | 0 |
| 0.9354166666666667 | 0 |
| 0.936111111111111 | 0 |
| 0.9368055555555556 | 0 |
| 0.9375 | 0 |
| 0.9381944444444444 | 0 |
| 0.938888888888889 | 0 |
| 0.9395833333333333 | 0 |
| 0.9402777777777778 | 0 |
| 0.9409722222222222 | 0 |
| 0.9416666666666668 | 0 |
| 0.9423611111111111 | 0 |
| 0.9430555555555555 | 0 |
| 0.94375 | 0 |
| 0.9444444444444445 | 0 |
| 0.9451388888888889 | 0 |
| 0.9458333333333333 | 0 |
| 0.9465277777777777 | 0 |
| 0.9472222222222223 | 0 |
| 0.9479166666666666 | 0 |
| 0.9486111111111111 | 0 |
| 0.9493055555555556 | 0 |
| 0.9500000000000001 | 0 |
| 0.9506944444444444 | 0 |
| 0.9513888888888888 | 0 |
| 0.9520833333333334 | 0 |
| 0.9527777777777778 | 0 |
| 0.9534722222222222 | 0 |
| 0.9541666666666666 | 0 |
| 0.9548611111111112 | 0 |
| 0.9555555555555556 | 0 |
| 0.9562499999999999 | 0 |
| 0.9569444444444444 | 0 |
| 0.9576388888888889 | 0 |
| 0.9583333333333334 | 0 |
| 0.9590277777777777 | 0 |
| 0.9597222222222223 | 0 |
| 0.9604166666666667 | 0 |
| 0.9611111111111111 | 0 |
| 0.9618055555555555 | 0 |
| 0.9625 | 0 |
| 0.9631944444444445 | 0 |
| 0.9638888888888889 | 0 |
| 0.9645833333333332 | 0 |
| 0.9652777777777778 | 0 |
| 0.9659722222222222 | 0 |
| 0.9666666666666667 | 0 |
| 0.967361111111111 | 0 |
| 0.9680555555555556 | 0 |
| 0.96875 | 0 |
| 0.9694444444444444 | 0 |
| 0.970138888888889 | 0 |
| 0.9708333333333333 | 0 |
| 0.9715277777777778 | 0 |
| 0.9722222222222222 | 0 |
| 0.9729166666666668 | 0 |
| 0.9736111111111111 | 0 |
| 0.9743055555555555 | 0 |
| 0.975 | 0 |
| 0.9756944444444445 | 0 |
| 0.9763888888888889 | 0 |
| 0.9770833333333333 | 0 |
| 0.9777777777777777 | 0 |
| 0.9784722222222223 | 0 |
| 0.9791666666666666 | 0 |
| 0.9798611111111111 | 0 |
| 0.9805555555555556 | 0 |
| 0.9812500000000001 | 0 |
| 0.9819444444444444 | 0 |
| 0.9826388888888888 | 0 |
| 0.9833333333333334 | 0 |
| 0.9840277777777778 | 0 |
| 0.9847222222222222 | 0 |
| 0.9854166666666666 | 0 |
| 0.9861111111111112 | 0 |
| 0.9868055555555556 | 0 |
| 0.9874999999999999 | 0 |
| 0.9881944444444444 | 0 |
| 0.9888888888888889 | 0 |
| 0.9895833333333334 | 0 |
| 0.9902777777777777 | 0 |
| 0.9909722222222223 | 0 |
| 0.9916666666666667 | 0 |
| 0.9923611111111111 | 0 |
| 0.9930555555555555 | 0 |
| 0.99375 | 0 |
| 0.9944444444444445 | 0 |
| 0.9951388888888889 | 0 |
| 0.9958333333333332 | 0 |
| 0.9965277777777778 | 0 |
| 0.9972222222222222 | 0 |
| 0.9979166666666667 | 0 |
| 0.998611111111111 | 0 |
| 0.9993055555555556 | 0 |